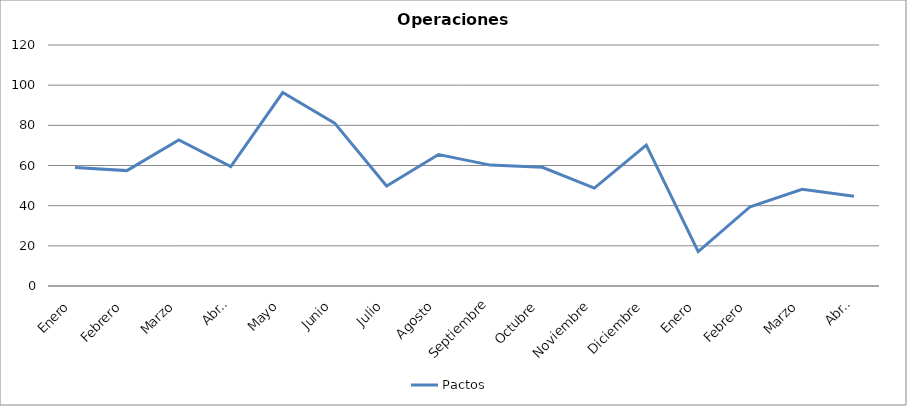
| Category | Pactos |
|---|---|
| Enero | 59 |
| Febrero | 57.45 |
| Marzo | 72.696 |
| Abril | 59.45 |
| Mayo | 96.318 |
| Junio | 81.095 |
| Julio | 49.81 |
| Agosto | 65.455 |
| Septiembre | 60.19 |
| Octubre | 59.105 |
| Noviembre | 48.762 |
| Diciembre | 70.19 |
| Enero | 17.091 |
| Febrero | 39.476 |
| Marzo | 48.182 |
| Abril | 44.7 |